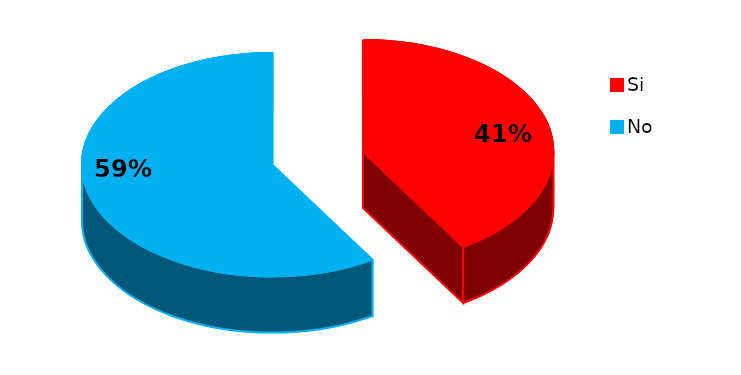
| Category | Series 0 |
|---|---|
| 0 | 14 |
| 1 | 20 |